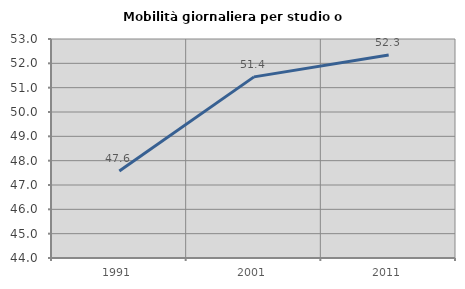
| Category | Mobilità giornaliera per studio o lavoro |
|---|---|
| 1991.0 | 47.577 |
| 2001.0 | 51.443 |
| 2011.0 | 52.342 |